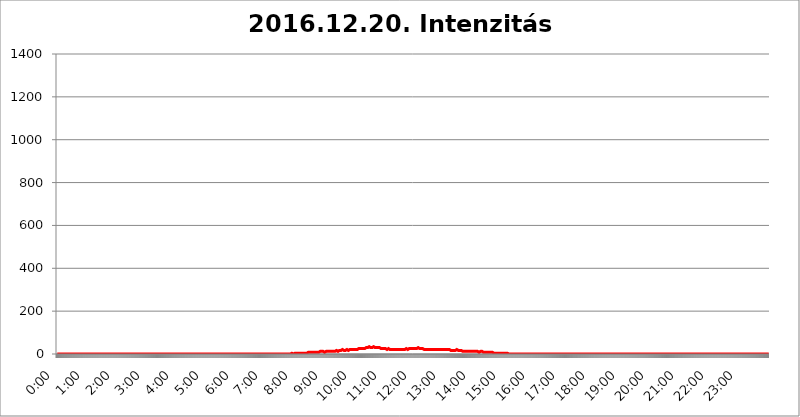
| Category | 2016.12.20. Intenzitás [W/m^2] |
|---|---|
| 0.0 | 0 |
| 0.0006944444444444445 | 0 |
| 0.001388888888888889 | 0 |
| 0.0020833333333333333 | 0 |
| 0.002777777777777778 | 0 |
| 0.003472222222222222 | 0 |
| 0.004166666666666667 | 0 |
| 0.004861111111111111 | 0 |
| 0.005555555555555556 | 0 |
| 0.0062499999999999995 | 0 |
| 0.006944444444444444 | 0 |
| 0.007638888888888889 | 0 |
| 0.008333333333333333 | 0 |
| 0.009027777777777779 | 0 |
| 0.009722222222222222 | 0 |
| 0.010416666666666666 | 0 |
| 0.011111111111111112 | 0 |
| 0.011805555555555555 | 0 |
| 0.012499999999999999 | 0 |
| 0.013194444444444444 | 0 |
| 0.013888888888888888 | 0 |
| 0.014583333333333332 | 0 |
| 0.015277777777777777 | 0 |
| 0.015972222222222224 | 0 |
| 0.016666666666666666 | 0 |
| 0.017361111111111112 | 0 |
| 0.018055555555555557 | 0 |
| 0.01875 | 0 |
| 0.019444444444444445 | 0 |
| 0.02013888888888889 | 0 |
| 0.020833333333333332 | 0 |
| 0.02152777777777778 | 0 |
| 0.022222222222222223 | 0 |
| 0.02291666666666667 | 0 |
| 0.02361111111111111 | 0 |
| 0.024305555555555556 | 0 |
| 0.024999999999999998 | 0 |
| 0.025694444444444447 | 0 |
| 0.02638888888888889 | 0 |
| 0.027083333333333334 | 0 |
| 0.027777777777777776 | 0 |
| 0.02847222222222222 | 0 |
| 0.029166666666666664 | 0 |
| 0.029861111111111113 | 0 |
| 0.030555555555555555 | 0 |
| 0.03125 | 0 |
| 0.03194444444444445 | 0 |
| 0.03263888888888889 | 0 |
| 0.03333333333333333 | 0 |
| 0.034027777777777775 | 0 |
| 0.034722222222222224 | 0 |
| 0.035416666666666666 | 0 |
| 0.036111111111111115 | 0 |
| 0.03680555555555556 | 0 |
| 0.0375 | 0 |
| 0.03819444444444444 | 0 |
| 0.03888888888888889 | 0 |
| 0.03958333333333333 | 0 |
| 0.04027777777777778 | 0 |
| 0.04097222222222222 | 0 |
| 0.041666666666666664 | 0 |
| 0.042361111111111106 | 0 |
| 0.04305555555555556 | 0 |
| 0.043750000000000004 | 0 |
| 0.044444444444444446 | 0 |
| 0.04513888888888889 | 0 |
| 0.04583333333333334 | 0 |
| 0.04652777777777778 | 0 |
| 0.04722222222222222 | 0 |
| 0.04791666666666666 | 0 |
| 0.04861111111111111 | 0 |
| 0.049305555555555554 | 0 |
| 0.049999999999999996 | 0 |
| 0.05069444444444445 | 0 |
| 0.051388888888888894 | 0 |
| 0.052083333333333336 | 0 |
| 0.05277777777777778 | 0 |
| 0.05347222222222222 | 0 |
| 0.05416666666666667 | 0 |
| 0.05486111111111111 | 0 |
| 0.05555555555555555 | 0 |
| 0.05625 | 0 |
| 0.05694444444444444 | 0 |
| 0.057638888888888885 | 0 |
| 0.05833333333333333 | 0 |
| 0.05902777777777778 | 0 |
| 0.059722222222222225 | 0 |
| 0.06041666666666667 | 0 |
| 0.061111111111111116 | 0 |
| 0.06180555555555556 | 0 |
| 0.0625 | 0 |
| 0.06319444444444444 | 0 |
| 0.06388888888888888 | 0 |
| 0.06458333333333334 | 0 |
| 0.06527777777777778 | 0 |
| 0.06597222222222222 | 0 |
| 0.06666666666666667 | 0 |
| 0.06736111111111111 | 0 |
| 0.06805555555555555 | 0 |
| 0.06874999999999999 | 0 |
| 0.06944444444444443 | 0 |
| 0.07013888888888889 | 0 |
| 0.07083333333333333 | 0 |
| 0.07152777777777779 | 0 |
| 0.07222222222222223 | 0 |
| 0.07291666666666667 | 0 |
| 0.07361111111111111 | 0 |
| 0.07430555555555556 | 0 |
| 0.075 | 0 |
| 0.07569444444444444 | 0 |
| 0.0763888888888889 | 0 |
| 0.07708333333333334 | 0 |
| 0.07777777777777778 | 0 |
| 0.07847222222222222 | 0 |
| 0.07916666666666666 | 0 |
| 0.0798611111111111 | 0 |
| 0.08055555555555556 | 0 |
| 0.08125 | 0 |
| 0.08194444444444444 | 0 |
| 0.08263888888888889 | 0 |
| 0.08333333333333333 | 0 |
| 0.08402777777777777 | 0 |
| 0.08472222222222221 | 0 |
| 0.08541666666666665 | 0 |
| 0.08611111111111112 | 0 |
| 0.08680555555555557 | 0 |
| 0.08750000000000001 | 0 |
| 0.08819444444444445 | 0 |
| 0.08888888888888889 | 0 |
| 0.08958333333333333 | 0 |
| 0.09027777777777778 | 0 |
| 0.09097222222222222 | 0 |
| 0.09166666666666667 | 0 |
| 0.09236111111111112 | 0 |
| 0.09305555555555556 | 0 |
| 0.09375 | 0 |
| 0.09444444444444444 | 0 |
| 0.09513888888888888 | 0 |
| 0.09583333333333333 | 0 |
| 0.09652777777777777 | 0 |
| 0.09722222222222222 | 0 |
| 0.09791666666666667 | 0 |
| 0.09861111111111111 | 0 |
| 0.09930555555555555 | 0 |
| 0.09999999999999999 | 0 |
| 0.10069444444444443 | 0 |
| 0.1013888888888889 | 0 |
| 0.10208333333333335 | 0 |
| 0.10277777777777779 | 0 |
| 0.10347222222222223 | 0 |
| 0.10416666666666667 | 0 |
| 0.10486111111111111 | 0 |
| 0.10555555555555556 | 0 |
| 0.10625 | 0 |
| 0.10694444444444444 | 0 |
| 0.1076388888888889 | 0 |
| 0.10833333333333334 | 0 |
| 0.10902777777777778 | 0 |
| 0.10972222222222222 | 0 |
| 0.1111111111111111 | 0 |
| 0.11180555555555556 | 0 |
| 0.11180555555555556 | 0 |
| 0.1125 | 0 |
| 0.11319444444444444 | 0 |
| 0.11388888888888889 | 0 |
| 0.11458333333333333 | 0 |
| 0.11527777777777777 | 0 |
| 0.11597222222222221 | 0 |
| 0.11666666666666665 | 0 |
| 0.1173611111111111 | 0 |
| 0.11805555555555557 | 0 |
| 0.11944444444444445 | 0 |
| 0.12013888888888889 | 0 |
| 0.12083333333333333 | 0 |
| 0.12152777777777778 | 0 |
| 0.12222222222222223 | 0 |
| 0.12291666666666667 | 0 |
| 0.12291666666666667 | 0 |
| 0.12361111111111112 | 0 |
| 0.12430555555555556 | 0 |
| 0.125 | 0 |
| 0.12569444444444444 | 0 |
| 0.12638888888888888 | 0 |
| 0.12708333333333333 | 0 |
| 0.16875 | 0 |
| 0.12847222222222224 | 0 |
| 0.12916666666666668 | 0 |
| 0.12986111111111112 | 0 |
| 0.13055555555555556 | 0 |
| 0.13125 | 0 |
| 0.13194444444444445 | 0 |
| 0.1326388888888889 | 0 |
| 0.13333333333333333 | 0 |
| 0.13402777777777777 | 0 |
| 0.13402777777777777 | 0 |
| 0.13472222222222222 | 0 |
| 0.13541666666666666 | 0 |
| 0.1361111111111111 | 0 |
| 0.13749999999999998 | 0 |
| 0.13819444444444443 | 0 |
| 0.1388888888888889 | 0 |
| 0.13958333333333334 | 0 |
| 0.14027777777777778 | 0 |
| 0.14097222222222222 | 0 |
| 0.14166666666666666 | 0 |
| 0.1423611111111111 | 0 |
| 0.14305555555555557 | 0 |
| 0.14375000000000002 | 0 |
| 0.14444444444444446 | 0 |
| 0.1451388888888889 | 0 |
| 0.1451388888888889 | 0 |
| 0.14652777777777778 | 0 |
| 0.14722222222222223 | 0 |
| 0.14791666666666667 | 0 |
| 0.1486111111111111 | 0 |
| 0.14930555555555555 | 0 |
| 0.15 | 0 |
| 0.15069444444444444 | 0 |
| 0.15138888888888888 | 0 |
| 0.15208333333333332 | 0 |
| 0.15277777777777776 | 0 |
| 0.15347222222222223 | 0 |
| 0.15416666666666667 | 0 |
| 0.15486111111111112 | 0 |
| 0.15555555555555556 | 0 |
| 0.15625 | 0 |
| 0.15694444444444444 | 0 |
| 0.15763888888888888 | 0 |
| 0.15833333333333333 | 0 |
| 0.15902777777777777 | 0 |
| 0.15972222222222224 | 0 |
| 0.16041666666666668 | 0 |
| 0.16111111111111112 | 0 |
| 0.16180555555555556 | 0 |
| 0.1625 | 0 |
| 0.16319444444444445 | 0 |
| 0.1638888888888889 | 0 |
| 0.16458333333333333 | 0 |
| 0.16527777777777777 | 0 |
| 0.16597222222222222 | 0 |
| 0.16666666666666666 | 0 |
| 0.1673611111111111 | 0 |
| 0.16805555555555554 | 0 |
| 0.16874999999999998 | 0 |
| 0.16944444444444443 | 0 |
| 0.17013888888888887 | 0 |
| 0.1708333333333333 | 0 |
| 0.17152777777777775 | 0 |
| 0.17222222222222225 | 0 |
| 0.1729166666666667 | 0 |
| 0.17361111111111113 | 0 |
| 0.17430555555555557 | 0 |
| 0.17500000000000002 | 0 |
| 0.17569444444444446 | 0 |
| 0.1763888888888889 | 0 |
| 0.17708333333333334 | 0 |
| 0.17777777777777778 | 0 |
| 0.17847222222222223 | 0 |
| 0.17916666666666667 | 0 |
| 0.1798611111111111 | 0 |
| 0.18055555555555555 | 0 |
| 0.18125 | 0 |
| 0.18194444444444444 | 0 |
| 0.1826388888888889 | 0 |
| 0.18333333333333335 | 0 |
| 0.1840277777777778 | 0 |
| 0.18472222222222223 | 0 |
| 0.18541666666666667 | 0 |
| 0.18611111111111112 | 0 |
| 0.18680555555555556 | 0 |
| 0.1875 | 0 |
| 0.18819444444444444 | 0 |
| 0.18888888888888888 | 0 |
| 0.18958333333333333 | 0 |
| 0.19027777777777777 | 0 |
| 0.1909722222222222 | 0 |
| 0.19166666666666665 | 0 |
| 0.19236111111111112 | 0 |
| 0.19305555555555554 | 0 |
| 0.19375 | 0 |
| 0.19444444444444445 | 0 |
| 0.1951388888888889 | 0 |
| 0.19583333333333333 | 0 |
| 0.19652777777777777 | 0 |
| 0.19722222222222222 | 0 |
| 0.19791666666666666 | 0 |
| 0.1986111111111111 | 0 |
| 0.19930555555555554 | 0 |
| 0.19999999999999998 | 0 |
| 0.20069444444444443 | 0 |
| 0.20138888888888887 | 0 |
| 0.2020833333333333 | 0 |
| 0.2027777777777778 | 0 |
| 0.2034722222222222 | 0 |
| 0.2041666666666667 | 0 |
| 0.20486111111111113 | 0 |
| 0.20555555555555557 | 0 |
| 0.20625000000000002 | 0 |
| 0.20694444444444446 | 0 |
| 0.2076388888888889 | 0 |
| 0.20833333333333334 | 0 |
| 0.20902777777777778 | 0 |
| 0.20972222222222223 | 0 |
| 0.21041666666666667 | 0 |
| 0.2111111111111111 | 0 |
| 0.21180555555555555 | 0 |
| 0.2125 | 0 |
| 0.21319444444444444 | 0 |
| 0.2138888888888889 | 0 |
| 0.21458333333333335 | 0 |
| 0.2152777777777778 | 0 |
| 0.21597222222222223 | 0 |
| 0.21666666666666667 | 0 |
| 0.21736111111111112 | 0 |
| 0.21805555555555556 | 0 |
| 0.21875 | 0 |
| 0.21944444444444444 | 0 |
| 0.22013888888888888 | 0 |
| 0.22083333333333333 | 0 |
| 0.22152777777777777 | 0 |
| 0.2222222222222222 | 0 |
| 0.22291666666666665 | 0 |
| 0.2236111111111111 | 0 |
| 0.22430555555555556 | 0 |
| 0.225 | 0 |
| 0.22569444444444445 | 0 |
| 0.2263888888888889 | 0 |
| 0.22708333333333333 | 0 |
| 0.22777777777777777 | 0 |
| 0.22847222222222222 | 0 |
| 0.22916666666666666 | 0 |
| 0.2298611111111111 | 0 |
| 0.23055555555555554 | 0 |
| 0.23124999999999998 | 0 |
| 0.23194444444444443 | 0 |
| 0.23263888888888887 | 0 |
| 0.2333333333333333 | 0 |
| 0.2340277777777778 | 0 |
| 0.2347222222222222 | 0 |
| 0.2354166666666667 | 0 |
| 0.23611111111111113 | 0 |
| 0.23680555555555557 | 0 |
| 0.23750000000000002 | 0 |
| 0.23819444444444446 | 0 |
| 0.2388888888888889 | 0 |
| 0.23958333333333334 | 0 |
| 0.24027777777777778 | 0 |
| 0.24097222222222223 | 0 |
| 0.24166666666666667 | 0 |
| 0.2423611111111111 | 0 |
| 0.24305555555555555 | 0 |
| 0.24375 | 0 |
| 0.24444444444444446 | 0 |
| 0.24513888888888888 | 0 |
| 0.24583333333333335 | 0 |
| 0.2465277777777778 | 0 |
| 0.24722222222222223 | 0 |
| 0.24791666666666667 | 0 |
| 0.24861111111111112 | 0 |
| 0.24930555555555556 | 0 |
| 0.25 | 0 |
| 0.25069444444444444 | 0 |
| 0.2513888888888889 | 0 |
| 0.2520833333333333 | 0 |
| 0.25277777777777777 | 0 |
| 0.2534722222222222 | 0 |
| 0.25416666666666665 | 0 |
| 0.2548611111111111 | 0 |
| 0.2555555555555556 | 0 |
| 0.25625000000000003 | 0 |
| 0.2569444444444445 | 0 |
| 0.2576388888888889 | 0 |
| 0.25833333333333336 | 0 |
| 0.2590277777777778 | 0 |
| 0.25972222222222224 | 0 |
| 0.2604166666666667 | 0 |
| 0.2611111111111111 | 0 |
| 0.26180555555555557 | 0 |
| 0.2625 | 0 |
| 0.26319444444444445 | 0 |
| 0.2638888888888889 | 0 |
| 0.26458333333333334 | 0 |
| 0.2652777777777778 | 0 |
| 0.2659722222222222 | 0 |
| 0.26666666666666666 | 0 |
| 0.2673611111111111 | 0 |
| 0.26805555555555555 | 0 |
| 0.26875 | 0 |
| 0.26944444444444443 | 0 |
| 0.2701388888888889 | 0 |
| 0.2708333333333333 | 0 |
| 0.27152777777777776 | 0 |
| 0.2722222222222222 | 0 |
| 0.27291666666666664 | 0 |
| 0.2736111111111111 | 0 |
| 0.2743055555555555 | 0 |
| 0.27499999999999997 | 0 |
| 0.27569444444444446 | 0 |
| 0.27638888888888885 | 0 |
| 0.27708333333333335 | 0 |
| 0.2777777777777778 | 0 |
| 0.27847222222222223 | 0 |
| 0.2791666666666667 | 0 |
| 0.2798611111111111 | 0 |
| 0.28055555555555556 | 0 |
| 0.28125 | 0 |
| 0.28194444444444444 | 0 |
| 0.2826388888888889 | 0 |
| 0.2833333333333333 | 0 |
| 0.28402777777777777 | 0 |
| 0.2847222222222222 | 0 |
| 0.28541666666666665 | 0 |
| 0.28611111111111115 | 0 |
| 0.28680555555555554 | 0 |
| 0.28750000000000003 | 0 |
| 0.2881944444444445 | 0 |
| 0.2888888888888889 | 0 |
| 0.28958333333333336 | 0 |
| 0.2902777777777778 | 0 |
| 0.29097222222222224 | 0 |
| 0.2916666666666667 | 0 |
| 0.2923611111111111 | 0 |
| 0.29305555555555557 | 0 |
| 0.29375 | 0 |
| 0.29444444444444445 | 0 |
| 0.2951388888888889 | 0 |
| 0.29583333333333334 | 0 |
| 0.2965277777777778 | 0 |
| 0.2972222222222222 | 0 |
| 0.29791666666666666 | 0 |
| 0.2986111111111111 | 0 |
| 0.29930555555555555 | 0 |
| 0.3 | 0 |
| 0.30069444444444443 | 0 |
| 0.3013888888888889 | 0 |
| 0.3020833333333333 | 0 |
| 0.30277777777777776 | 0 |
| 0.3034722222222222 | 0 |
| 0.30416666666666664 | 0 |
| 0.3048611111111111 | 0 |
| 0.3055555555555555 | 0 |
| 0.30624999999999997 | 0 |
| 0.3069444444444444 | 0 |
| 0.3076388888888889 | 0 |
| 0.30833333333333335 | 0 |
| 0.3090277777777778 | 0 |
| 0.30972222222222223 | 0 |
| 0.3104166666666667 | 0 |
| 0.3111111111111111 | 0 |
| 0.31180555555555556 | 0 |
| 0.3125 | 0 |
| 0.31319444444444444 | 0 |
| 0.3138888888888889 | 0 |
| 0.3145833333333333 | 0 |
| 0.31527777777777777 | 0 |
| 0.3159722222222222 | 0 |
| 0.31666666666666665 | 0 |
| 0.31736111111111115 | 0 |
| 0.31805555555555554 | 0 |
| 0.31875000000000003 | 0 |
| 0.3194444444444445 | 0 |
| 0.3201388888888889 | 0 |
| 0.32083333333333336 | 0 |
| 0.3215277777777778 | 0 |
| 0.32222222222222224 | 0 |
| 0.3229166666666667 | 0 |
| 0.3236111111111111 | 0 |
| 0.32430555555555557 | 0 |
| 0.325 | 0 |
| 0.32569444444444445 | 0 |
| 0.3263888888888889 | 0 |
| 0.32708333333333334 | 0 |
| 0.3277777777777778 | 0 |
| 0.3284722222222222 | 0 |
| 0.32916666666666666 | 3.525 |
| 0.3298611111111111 | 0 |
| 0.33055555555555555 | 0 |
| 0.33125 | 0 |
| 0.33194444444444443 | 3.525 |
| 0.3326388888888889 | 0 |
| 0.3333333333333333 | 3.525 |
| 0.3340277777777778 | 3.525 |
| 0.3347222222222222 | 3.525 |
| 0.3354166666666667 | 3.525 |
| 0.3361111111111111 | 3.525 |
| 0.3368055555555556 | 3.525 |
| 0.33749999999999997 | 3.525 |
| 0.33819444444444446 | 3.525 |
| 0.33888888888888885 | 3.525 |
| 0.33958333333333335 | 3.525 |
| 0.34027777777777773 | 3.525 |
| 0.34097222222222223 | 3.525 |
| 0.3416666666666666 | 3.525 |
| 0.3423611111111111 | 3.525 |
| 0.3430555555555555 | 3.525 |
| 0.34375 | 3.525 |
| 0.3444444444444445 | 3.525 |
| 0.3451388888888889 | 3.525 |
| 0.3458333333333334 | 3.525 |
| 0.34652777777777777 | 3.525 |
| 0.34722222222222227 | 3.525 |
| 0.34791666666666665 | 3.525 |
| 0.34861111111111115 | 3.525 |
| 0.34930555555555554 | 3.525 |
| 0.35000000000000003 | 3.525 |
| 0.3506944444444444 | 7.887 |
| 0.3513888888888889 | 7.887 |
| 0.3520833333333333 | 7.887 |
| 0.3527777777777778 | 7.887 |
| 0.3534722222222222 | 7.887 |
| 0.3541666666666667 | 7.887 |
| 0.3548611111111111 | 7.887 |
| 0.35555555555555557 | 7.887 |
| 0.35625 | 7.887 |
| 0.35694444444444445 | 7.887 |
| 0.3576388888888889 | 7.887 |
| 0.35833333333333334 | 7.887 |
| 0.3590277777777778 | 7.887 |
| 0.3597222222222222 | 7.887 |
| 0.36041666666666666 | 7.887 |
| 0.3611111111111111 | 7.887 |
| 0.36180555555555555 | 7.887 |
| 0.3625 | 7.887 |
| 0.36319444444444443 | 7.887 |
| 0.3638888888888889 | 7.887 |
| 0.3645833333333333 | 7.887 |
| 0.3652777777777778 | 7.887 |
| 0.3659722222222222 | 7.887 |
| 0.3666666666666667 | 7.887 |
| 0.3673611111111111 | 7.887 |
| 0.3680555555555556 | 12.257 |
| 0.36874999999999997 | 12.257 |
| 0.36944444444444446 | 7.887 |
| 0.37013888888888885 | 12.257 |
| 0.37083333333333335 | 12.257 |
| 0.37152777777777773 | 12.257 |
| 0.37222222222222223 | 12.257 |
| 0.3729166666666666 | 12.257 |
| 0.3736111111111111 | 12.257 |
| 0.3743055555555555 | 12.257 |
| 0.375 | 7.887 |
| 0.3756944444444445 | 12.257 |
| 0.3763888888888889 | 12.257 |
| 0.3770833333333334 | 12.257 |
| 0.37777777777777777 | 12.257 |
| 0.37847222222222227 | 12.257 |
| 0.37916666666666665 | 12.257 |
| 0.37986111111111115 | 12.257 |
| 0.38055555555555554 | 12.257 |
| 0.38125000000000003 | 12.257 |
| 0.3819444444444444 | 12.257 |
| 0.3826388888888889 | 12.257 |
| 0.3833333333333333 | 12.257 |
| 0.3840277777777778 | 12.257 |
| 0.3847222222222222 | 12.257 |
| 0.3854166666666667 | 12.257 |
| 0.3861111111111111 | 12.257 |
| 0.38680555555555557 | 12.257 |
| 0.3875 | 12.257 |
| 0.38819444444444445 | 12.257 |
| 0.3888888888888889 | 12.257 |
| 0.38958333333333334 | 12.257 |
| 0.3902777777777778 | 16.636 |
| 0.3909722222222222 | 16.636 |
| 0.39166666666666666 | 16.636 |
| 0.3923611111111111 | 16.636 |
| 0.39305555555555555 | 16.636 |
| 0.39375 | 12.257 |
| 0.39444444444444443 | 16.636 |
| 0.3951388888888889 | 16.636 |
| 0.3958333333333333 | 16.636 |
| 0.3965277777777778 | 16.636 |
| 0.3972222222222222 | 16.636 |
| 0.3979166666666667 | 16.636 |
| 0.3986111111111111 | 16.636 |
| 0.3993055555555556 | 21.024 |
| 0.39999999999999997 | 21.024 |
| 0.40069444444444446 | 21.024 |
| 0.40138888888888885 | 16.636 |
| 0.40208333333333335 | 16.636 |
| 0.40277777777777773 | 21.024 |
| 0.40347222222222223 | 21.024 |
| 0.4041666666666666 | 16.636 |
| 0.4048611111111111 | 21.024 |
| 0.4055555555555555 | 21.024 |
| 0.40625 | 21.024 |
| 0.4069444444444445 | 21.024 |
| 0.4076388888888889 | 21.024 |
| 0.4083333333333334 | 16.636 |
| 0.40902777777777777 | 16.636 |
| 0.40972222222222227 | 16.636 |
| 0.41041666666666665 | 21.024 |
| 0.41111111111111115 | 21.024 |
| 0.41180555555555554 | 21.024 |
| 0.41250000000000003 | 21.024 |
| 0.4131944444444444 | 21.024 |
| 0.4138888888888889 | 21.024 |
| 0.4145833333333333 | 21.024 |
| 0.4152777777777778 | 21.024 |
| 0.4159722222222222 | 21.024 |
| 0.4166666666666667 | 21.024 |
| 0.4173611111111111 | 21.024 |
| 0.41805555555555557 | 21.024 |
| 0.41875 | 21.024 |
| 0.41944444444444445 | 21.024 |
| 0.4201388888888889 | 21.024 |
| 0.42083333333333334 | 21.024 |
| 0.4215277777777778 | 21.024 |
| 0.4222222222222222 | 25.419 |
| 0.42291666666666666 | 25.419 |
| 0.4236111111111111 | 21.024 |
| 0.42430555555555555 | 25.419 |
| 0.425 | 25.419 |
| 0.42569444444444443 | 25.419 |
| 0.4263888888888889 | 25.419 |
| 0.4270833333333333 | 25.419 |
| 0.4277777777777778 | 25.419 |
| 0.4284722222222222 | 25.419 |
| 0.4291666666666667 | 25.419 |
| 0.4298611111111111 | 25.419 |
| 0.4305555555555556 | 25.419 |
| 0.43124999999999997 | 25.419 |
| 0.43194444444444446 | 25.419 |
| 0.43263888888888885 | 25.419 |
| 0.43333333333333335 | 29.823 |
| 0.43402777777777773 | 29.823 |
| 0.43472222222222223 | 29.823 |
| 0.4354166666666666 | 29.823 |
| 0.4361111111111111 | 29.823 |
| 0.4368055555555555 | 34.234 |
| 0.4375 | 34.234 |
| 0.4381944444444445 | 34.234 |
| 0.4388888888888889 | 34.234 |
| 0.4395833333333334 | 29.823 |
| 0.44027777777777777 | 29.823 |
| 0.44097222222222227 | 29.823 |
| 0.44166666666666665 | 29.823 |
| 0.44236111111111115 | 34.234 |
| 0.44305555555555554 | 34.234 |
| 0.44375000000000003 | 34.234 |
| 0.4444444444444444 | 34.234 |
| 0.4451388888888889 | 29.823 |
| 0.4458333333333333 | 29.823 |
| 0.4465277777777778 | 29.823 |
| 0.4472222222222222 | 29.823 |
| 0.4479166666666667 | 29.823 |
| 0.4486111111111111 | 29.823 |
| 0.44930555555555557 | 25.419 |
| 0.45 | 29.823 |
| 0.45069444444444445 | 29.823 |
| 0.4513888888888889 | 29.823 |
| 0.45208333333333334 | 29.823 |
| 0.4527777777777778 | 25.419 |
| 0.4534722222222222 | 25.419 |
| 0.45416666666666666 | 25.419 |
| 0.4548611111111111 | 25.419 |
| 0.45555555555555555 | 25.419 |
| 0.45625 | 25.419 |
| 0.45694444444444443 | 25.419 |
| 0.4576388888888889 | 25.419 |
| 0.4583333333333333 | 25.419 |
| 0.4590277777777778 | 25.419 |
| 0.4597222222222222 | 25.419 |
| 0.4604166666666667 | 25.419 |
| 0.4611111111111111 | 21.024 |
| 0.4618055555555556 | 21.024 |
| 0.46249999999999997 | 21.024 |
| 0.46319444444444446 | 25.419 |
| 0.46388888888888885 | 25.419 |
| 0.46458333333333335 | 25.419 |
| 0.46527777777777773 | 21.024 |
| 0.46597222222222223 | 21.024 |
| 0.4666666666666666 | 21.024 |
| 0.4673611111111111 | 21.024 |
| 0.4680555555555555 | 21.024 |
| 0.46875 | 21.024 |
| 0.4694444444444445 | 21.024 |
| 0.4701388888888889 | 21.024 |
| 0.4708333333333334 | 21.024 |
| 0.47152777777777777 | 21.024 |
| 0.47222222222222227 | 21.024 |
| 0.47291666666666665 | 21.024 |
| 0.47361111111111115 | 21.024 |
| 0.47430555555555554 | 21.024 |
| 0.47500000000000003 | 21.024 |
| 0.4756944444444444 | 21.024 |
| 0.4763888888888889 | 21.024 |
| 0.4770833333333333 | 21.024 |
| 0.4777777777777778 | 21.024 |
| 0.4784722222222222 | 21.024 |
| 0.4791666666666667 | 21.024 |
| 0.4798611111111111 | 21.024 |
| 0.48055555555555557 | 21.024 |
| 0.48125 | 21.024 |
| 0.48194444444444445 | 21.024 |
| 0.4826388888888889 | 21.024 |
| 0.48333333333333334 | 21.024 |
| 0.4840277777777778 | 21.024 |
| 0.4847222222222222 | 21.024 |
| 0.48541666666666666 | 21.024 |
| 0.4861111111111111 | 21.024 |
| 0.48680555555555555 | 21.024 |
| 0.4875 | 21.024 |
| 0.48819444444444443 | 21.024 |
| 0.4888888888888889 | 25.419 |
| 0.4895833333333333 | 25.419 |
| 0.4902777777777778 | 25.419 |
| 0.4909722222222222 | 21.024 |
| 0.4916666666666667 | 21.024 |
| 0.4923611111111111 | 25.419 |
| 0.4930555555555556 | 25.419 |
| 0.49374999999999997 | 25.419 |
| 0.49444444444444446 | 25.419 |
| 0.49513888888888885 | 25.419 |
| 0.49583333333333335 | 25.419 |
| 0.49652777777777773 | 25.419 |
| 0.49722222222222223 | 25.419 |
| 0.4979166666666666 | 25.419 |
| 0.4986111111111111 | 25.419 |
| 0.4993055555555555 | 25.419 |
| 0.5 | 25.419 |
| 0.5006944444444444 | 25.419 |
| 0.5013888888888889 | 25.419 |
| 0.5020833333333333 | 25.419 |
| 0.5027777777777778 | 25.419 |
| 0.5034722222222222 | 25.419 |
| 0.5041666666666667 | 25.419 |
| 0.5048611111111111 | 25.419 |
| 0.5055555555555555 | 29.823 |
| 0.50625 | 29.823 |
| 0.5069444444444444 | 29.823 |
| 0.5076388888888889 | 29.823 |
| 0.5083333333333333 | 25.419 |
| 0.5090277777777777 | 25.419 |
| 0.5097222222222222 | 25.419 |
| 0.5104166666666666 | 25.419 |
| 0.5111111111111112 | 25.419 |
| 0.5118055555555555 | 25.419 |
| 0.5125000000000001 | 25.419 |
| 0.5131944444444444 | 25.419 |
| 0.513888888888889 | 21.024 |
| 0.5145833333333333 | 21.024 |
| 0.5152777777777778 | 21.024 |
| 0.5159722222222222 | 21.024 |
| 0.5166666666666667 | 21.024 |
| 0.517361111111111 | 21.024 |
| 0.5180555555555556 | 21.024 |
| 0.5187499999999999 | 21.024 |
| 0.5194444444444445 | 21.024 |
| 0.5201388888888888 | 21.024 |
| 0.5208333333333334 | 21.024 |
| 0.5215277777777778 | 21.024 |
| 0.5222222222222223 | 21.024 |
| 0.5229166666666667 | 21.024 |
| 0.5236111111111111 | 21.024 |
| 0.5243055555555556 | 21.024 |
| 0.525 | 21.024 |
| 0.5256944444444445 | 21.024 |
| 0.5263888888888889 | 21.024 |
| 0.5270833333333333 | 21.024 |
| 0.5277777777777778 | 21.024 |
| 0.5284722222222222 | 21.024 |
| 0.5291666666666667 | 21.024 |
| 0.5298611111111111 | 21.024 |
| 0.5305555555555556 | 21.024 |
| 0.53125 | 21.024 |
| 0.5319444444444444 | 21.024 |
| 0.5326388888888889 | 21.024 |
| 0.5333333333333333 | 21.024 |
| 0.5340277777777778 | 21.024 |
| 0.5347222222222222 | 21.024 |
| 0.5354166666666667 | 21.024 |
| 0.5361111111111111 | 21.024 |
| 0.5368055555555555 | 21.024 |
| 0.5375 | 21.024 |
| 0.5381944444444444 | 21.024 |
| 0.5388888888888889 | 21.024 |
| 0.5395833333333333 | 21.024 |
| 0.5402777777777777 | 21.024 |
| 0.5409722222222222 | 21.024 |
| 0.5416666666666666 | 21.024 |
| 0.5423611111111112 | 21.024 |
| 0.5430555555555555 | 21.024 |
| 0.5437500000000001 | 21.024 |
| 0.5444444444444444 | 21.024 |
| 0.545138888888889 | 21.024 |
| 0.5458333333333333 | 21.024 |
| 0.5465277777777778 | 21.024 |
| 0.5472222222222222 | 21.024 |
| 0.5479166666666667 | 21.024 |
| 0.548611111111111 | 21.024 |
| 0.5493055555555556 | 21.024 |
| 0.5499999999999999 | 21.024 |
| 0.5506944444444445 | 21.024 |
| 0.5513888888888888 | 16.636 |
| 0.5520833333333334 | 16.636 |
| 0.5527777777777778 | 16.636 |
| 0.5534722222222223 | 16.636 |
| 0.5541666666666667 | 16.636 |
| 0.5548611111111111 | 16.636 |
| 0.5555555555555556 | 16.636 |
| 0.55625 | 16.636 |
| 0.5569444444444445 | 16.636 |
| 0.5576388888888889 | 16.636 |
| 0.5583333333333333 | 16.636 |
| 0.5590277777777778 | 16.636 |
| 0.5597222222222222 | 16.636 |
| 0.5604166666666667 | 21.024 |
| 0.5611111111111111 | 16.636 |
| 0.5618055555555556 | 16.636 |
| 0.5625 | 16.636 |
| 0.5631944444444444 | 16.636 |
| 0.5638888888888889 | 16.636 |
| 0.5645833333333333 | 16.636 |
| 0.5652777777777778 | 16.636 |
| 0.5659722222222222 | 16.636 |
| 0.5666666666666667 | 16.636 |
| 0.5673611111111111 | 16.636 |
| 0.5680555555555555 | 16.636 |
| 0.56875 | 12.257 |
| 0.5694444444444444 | 16.636 |
| 0.5701388888888889 | 16.636 |
| 0.5708333333333333 | 12.257 |
| 0.5715277777777777 | 16.636 |
| 0.5722222222222222 | 12.257 |
| 0.5729166666666666 | 12.257 |
| 0.5736111111111112 | 12.257 |
| 0.5743055555555555 | 12.257 |
| 0.5750000000000001 | 12.257 |
| 0.5756944444444444 | 12.257 |
| 0.576388888888889 | 12.257 |
| 0.5770833333333333 | 12.257 |
| 0.5777777777777778 | 12.257 |
| 0.5784722222222222 | 12.257 |
| 0.5791666666666667 | 12.257 |
| 0.579861111111111 | 12.257 |
| 0.5805555555555556 | 12.257 |
| 0.5812499999999999 | 12.257 |
| 0.5819444444444445 | 12.257 |
| 0.5826388888888888 | 12.257 |
| 0.5833333333333334 | 12.257 |
| 0.5840277777777778 | 12.257 |
| 0.5847222222222223 | 12.257 |
| 0.5854166666666667 | 12.257 |
| 0.5861111111111111 | 12.257 |
| 0.5868055555555556 | 12.257 |
| 0.5875 | 12.257 |
| 0.5881944444444445 | 12.257 |
| 0.5888888888888889 | 12.257 |
| 0.5895833333333333 | 12.257 |
| 0.5902777777777778 | 12.257 |
| 0.5909722222222222 | 7.887 |
| 0.5916666666666667 | 7.887 |
| 0.5923611111111111 | 7.887 |
| 0.5930555555555556 | 7.887 |
| 0.59375 | 12.257 |
| 0.5944444444444444 | 7.887 |
| 0.5951388888888889 | 12.257 |
| 0.5958333333333333 | 12.257 |
| 0.5965277777777778 | 7.887 |
| 0.5972222222222222 | 7.887 |
| 0.5979166666666667 | 7.887 |
| 0.5986111111111111 | 7.887 |
| 0.5993055555555555 | 7.887 |
| 0.6 | 7.887 |
| 0.6006944444444444 | 7.887 |
| 0.6013888888888889 | 7.887 |
| 0.6020833333333333 | 7.887 |
| 0.6027777777777777 | 7.887 |
| 0.6034722222222222 | 7.887 |
| 0.6041666666666666 | 7.887 |
| 0.6048611111111112 | 7.887 |
| 0.6055555555555555 | 7.887 |
| 0.6062500000000001 | 7.887 |
| 0.6069444444444444 | 7.887 |
| 0.607638888888889 | 7.887 |
| 0.6083333333333333 | 7.887 |
| 0.6090277777777778 | 7.887 |
| 0.6097222222222222 | 7.887 |
| 0.6104166666666667 | 7.887 |
| 0.611111111111111 | 7.887 |
| 0.6118055555555556 | 7.887 |
| 0.6124999999999999 | 3.525 |
| 0.6131944444444445 | 3.525 |
| 0.6138888888888888 | 3.525 |
| 0.6145833333333334 | 3.525 |
| 0.6152777777777778 | 3.525 |
| 0.6159722222222223 | 3.525 |
| 0.6166666666666667 | 3.525 |
| 0.6173611111111111 | 3.525 |
| 0.6180555555555556 | 3.525 |
| 0.61875 | 3.525 |
| 0.6194444444444445 | 3.525 |
| 0.6201388888888889 | 3.525 |
| 0.6208333333333333 | 3.525 |
| 0.6215277777777778 | 3.525 |
| 0.6222222222222222 | 3.525 |
| 0.6229166666666667 | 3.525 |
| 0.6236111111111111 | 3.525 |
| 0.6243055555555556 | 3.525 |
| 0.625 | 3.525 |
| 0.6256944444444444 | 3.525 |
| 0.6263888888888889 | 3.525 |
| 0.6270833333333333 | 3.525 |
| 0.6277777777777778 | 3.525 |
| 0.6284722222222222 | 3.525 |
| 0.6291666666666667 | 3.525 |
| 0.6298611111111111 | 3.525 |
| 0.6305555555555555 | 3.525 |
| 0.63125 | 3.525 |
| 0.6319444444444444 | 0 |
| 0.6326388888888889 | 0 |
| 0.6333333333333333 | 0 |
| 0.6340277777777777 | 0 |
| 0.6347222222222222 | 0 |
| 0.6354166666666666 | 0 |
| 0.6361111111111112 | 0 |
| 0.6368055555555555 | 0 |
| 0.6375000000000001 | 0 |
| 0.6381944444444444 | 0 |
| 0.638888888888889 | 0 |
| 0.6395833333333333 | 0 |
| 0.6402777777777778 | 0 |
| 0.6409722222222222 | 0 |
| 0.6416666666666667 | 0 |
| 0.642361111111111 | 0 |
| 0.6430555555555556 | 0 |
| 0.6437499999999999 | 0 |
| 0.6444444444444445 | 0 |
| 0.6451388888888888 | 0 |
| 0.6458333333333334 | 0 |
| 0.6465277777777778 | 0 |
| 0.6472222222222223 | 0 |
| 0.6479166666666667 | 0 |
| 0.6486111111111111 | 0 |
| 0.6493055555555556 | 0 |
| 0.65 | 0 |
| 0.6506944444444445 | 0 |
| 0.6513888888888889 | 0 |
| 0.6520833333333333 | 0 |
| 0.6527777777777778 | 0 |
| 0.6534722222222222 | 0 |
| 0.6541666666666667 | 0 |
| 0.6548611111111111 | 0 |
| 0.6555555555555556 | 0 |
| 0.65625 | 0 |
| 0.6569444444444444 | 0 |
| 0.6576388888888889 | 0 |
| 0.6583333333333333 | 0 |
| 0.6590277777777778 | 0 |
| 0.6597222222222222 | 0 |
| 0.6604166666666667 | 0 |
| 0.6611111111111111 | 0 |
| 0.6618055555555555 | 0 |
| 0.6625 | 0 |
| 0.6631944444444444 | 0 |
| 0.6638888888888889 | 0 |
| 0.6645833333333333 | 0 |
| 0.6652777777777777 | 0 |
| 0.6659722222222222 | 0 |
| 0.6666666666666666 | 0 |
| 0.6673611111111111 | 0 |
| 0.6680555555555556 | 0 |
| 0.6687500000000001 | 0 |
| 0.6694444444444444 | 0 |
| 0.6701388888888888 | 0 |
| 0.6708333333333334 | 0 |
| 0.6715277777777778 | 0 |
| 0.6722222222222222 | 0 |
| 0.6729166666666666 | 0 |
| 0.6736111111111112 | 0 |
| 0.6743055555555556 | 0 |
| 0.6749999999999999 | 0 |
| 0.6756944444444444 | 0 |
| 0.6763888888888889 | 0 |
| 0.6770833333333334 | 0 |
| 0.6777777777777777 | 0 |
| 0.6784722222222223 | 0 |
| 0.6791666666666667 | 0 |
| 0.6798611111111111 | 0 |
| 0.6805555555555555 | 0 |
| 0.68125 | 0 |
| 0.6819444444444445 | 0 |
| 0.6826388888888889 | 0 |
| 0.6833333333333332 | 0 |
| 0.6840277777777778 | 0 |
| 0.6847222222222222 | 0 |
| 0.6854166666666667 | 0 |
| 0.686111111111111 | 0 |
| 0.6868055555555556 | 0 |
| 0.6875 | 0 |
| 0.6881944444444444 | 0 |
| 0.688888888888889 | 0 |
| 0.6895833333333333 | 0 |
| 0.6902777777777778 | 0 |
| 0.6909722222222222 | 0 |
| 0.6916666666666668 | 0 |
| 0.6923611111111111 | 0 |
| 0.6930555555555555 | 0 |
| 0.69375 | 0 |
| 0.6944444444444445 | 0 |
| 0.6951388888888889 | 0 |
| 0.6958333333333333 | 0 |
| 0.6965277777777777 | 0 |
| 0.6972222222222223 | 0 |
| 0.6979166666666666 | 0 |
| 0.6986111111111111 | 0 |
| 0.6993055555555556 | 0 |
| 0.7000000000000001 | 0 |
| 0.7006944444444444 | 0 |
| 0.7013888888888888 | 0 |
| 0.7020833333333334 | 0 |
| 0.7027777777777778 | 0 |
| 0.7034722222222222 | 0 |
| 0.7041666666666666 | 0 |
| 0.7048611111111112 | 0 |
| 0.7055555555555556 | 0 |
| 0.7062499999999999 | 0 |
| 0.7069444444444444 | 0 |
| 0.7076388888888889 | 0 |
| 0.7083333333333334 | 0 |
| 0.7090277777777777 | 0 |
| 0.7097222222222223 | 0 |
| 0.7104166666666667 | 0 |
| 0.7111111111111111 | 0 |
| 0.7118055555555555 | 0 |
| 0.7125 | 0 |
| 0.7131944444444445 | 0 |
| 0.7138888888888889 | 0 |
| 0.7145833333333332 | 0 |
| 0.7152777777777778 | 0 |
| 0.7159722222222222 | 0 |
| 0.7166666666666667 | 0 |
| 0.717361111111111 | 0 |
| 0.7180555555555556 | 0 |
| 0.71875 | 0 |
| 0.7194444444444444 | 0 |
| 0.720138888888889 | 0 |
| 0.7208333333333333 | 0 |
| 0.7215277777777778 | 0 |
| 0.7222222222222222 | 0 |
| 0.7229166666666668 | 0 |
| 0.7236111111111111 | 0 |
| 0.7243055555555555 | 0 |
| 0.725 | 0 |
| 0.7256944444444445 | 0 |
| 0.7263888888888889 | 0 |
| 0.7270833333333333 | 0 |
| 0.7277777777777777 | 0 |
| 0.7284722222222223 | 0 |
| 0.7291666666666666 | 0 |
| 0.7298611111111111 | 0 |
| 0.7305555555555556 | 0 |
| 0.7312500000000001 | 0 |
| 0.7319444444444444 | 0 |
| 0.7326388888888888 | 0 |
| 0.7333333333333334 | 0 |
| 0.7340277777777778 | 0 |
| 0.7347222222222222 | 0 |
| 0.7354166666666666 | 0 |
| 0.7361111111111112 | 0 |
| 0.7368055555555556 | 0 |
| 0.7374999999999999 | 0 |
| 0.7381944444444444 | 0 |
| 0.7388888888888889 | 0 |
| 0.7395833333333334 | 0 |
| 0.7402777777777777 | 0 |
| 0.7409722222222223 | 0 |
| 0.7416666666666667 | 0 |
| 0.7423611111111111 | 0 |
| 0.7430555555555555 | 0 |
| 0.74375 | 0 |
| 0.7444444444444445 | 0 |
| 0.7451388888888889 | 0 |
| 0.7458333333333332 | 0 |
| 0.7465277777777778 | 0 |
| 0.7472222222222222 | 0 |
| 0.7479166666666667 | 0 |
| 0.748611111111111 | 0 |
| 0.7493055555555556 | 0 |
| 0.75 | 0 |
| 0.7506944444444444 | 0 |
| 0.751388888888889 | 0 |
| 0.7520833333333333 | 0 |
| 0.7527777777777778 | 0 |
| 0.7534722222222222 | 0 |
| 0.7541666666666668 | 0 |
| 0.7548611111111111 | 0 |
| 0.7555555555555555 | 0 |
| 0.75625 | 0 |
| 0.7569444444444445 | 0 |
| 0.7576388888888889 | 0 |
| 0.7583333333333333 | 0 |
| 0.7590277777777777 | 0 |
| 0.7597222222222223 | 0 |
| 0.7604166666666666 | 0 |
| 0.7611111111111111 | 0 |
| 0.7618055555555556 | 0 |
| 0.7625000000000001 | 0 |
| 0.7631944444444444 | 0 |
| 0.7638888888888888 | 0 |
| 0.7645833333333334 | 0 |
| 0.7652777777777778 | 0 |
| 0.7659722222222222 | 0 |
| 0.7666666666666666 | 0 |
| 0.7673611111111112 | 0 |
| 0.7680555555555556 | 0 |
| 0.7687499999999999 | 0 |
| 0.7694444444444444 | 0 |
| 0.7701388888888889 | 0 |
| 0.7708333333333334 | 0 |
| 0.7715277777777777 | 0 |
| 0.7722222222222223 | 0 |
| 0.7729166666666667 | 0 |
| 0.7736111111111111 | 0 |
| 0.7743055555555555 | 0 |
| 0.775 | 0 |
| 0.7756944444444445 | 0 |
| 0.7763888888888889 | 0 |
| 0.7770833333333332 | 0 |
| 0.7777777777777778 | 0 |
| 0.7784722222222222 | 0 |
| 0.7791666666666667 | 0 |
| 0.779861111111111 | 0 |
| 0.7805555555555556 | 0 |
| 0.78125 | 0 |
| 0.7819444444444444 | 0 |
| 0.782638888888889 | 0 |
| 0.7833333333333333 | 0 |
| 0.7840277777777778 | 0 |
| 0.7847222222222222 | 0 |
| 0.7854166666666668 | 0 |
| 0.7861111111111111 | 0 |
| 0.7868055555555555 | 0 |
| 0.7875 | 0 |
| 0.7881944444444445 | 0 |
| 0.7888888888888889 | 0 |
| 0.7895833333333333 | 0 |
| 0.7902777777777777 | 0 |
| 0.7909722222222223 | 0 |
| 0.7916666666666666 | 0 |
| 0.7923611111111111 | 0 |
| 0.7930555555555556 | 0 |
| 0.7937500000000001 | 0 |
| 0.7944444444444444 | 0 |
| 0.7951388888888888 | 0 |
| 0.7958333333333334 | 0 |
| 0.7965277777777778 | 0 |
| 0.7972222222222222 | 0 |
| 0.7979166666666666 | 0 |
| 0.7986111111111112 | 0 |
| 0.7993055555555556 | 0 |
| 0.7999999999999999 | 0 |
| 0.8006944444444444 | 0 |
| 0.8013888888888889 | 0 |
| 0.8020833333333334 | 0 |
| 0.8027777777777777 | 0 |
| 0.8034722222222223 | 0 |
| 0.8041666666666667 | 0 |
| 0.8048611111111111 | 0 |
| 0.8055555555555555 | 0 |
| 0.80625 | 0 |
| 0.8069444444444445 | 0 |
| 0.8076388888888889 | 0 |
| 0.8083333333333332 | 0 |
| 0.8090277777777778 | 0 |
| 0.8097222222222222 | 0 |
| 0.8104166666666667 | 0 |
| 0.811111111111111 | 0 |
| 0.8118055555555556 | 0 |
| 0.8125 | 0 |
| 0.8131944444444444 | 0 |
| 0.813888888888889 | 0 |
| 0.8145833333333333 | 0 |
| 0.8152777777777778 | 0 |
| 0.8159722222222222 | 0 |
| 0.8166666666666668 | 0 |
| 0.8173611111111111 | 0 |
| 0.8180555555555555 | 0 |
| 0.81875 | 0 |
| 0.8194444444444445 | 0 |
| 0.8201388888888889 | 0 |
| 0.8208333333333333 | 0 |
| 0.8215277777777777 | 0 |
| 0.8222222222222223 | 0 |
| 0.8229166666666666 | 0 |
| 0.8236111111111111 | 0 |
| 0.8243055555555556 | 0 |
| 0.8250000000000001 | 0 |
| 0.8256944444444444 | 0 |
| 0.8263888888888888 | 0 |
| 0.8270833333333334 | 0 |
| 0.8277777777777778 | 0 |
| 0.8284722222222222 | 0 |
| 0.8291666666666666 | 0 |
| 0.8298611111111112 | 0 |
| 0.8305555555555556 | 0 |
| 0.8312499999999999 | 0 |
| 0.8319444444444444 | 0 |
| 0.8326388888888889 | 0 |
| 0.8333333333333334 | 0 |
| 0.8340277777777777 | 0 |
| 0.8347222222222223 | 0 |
| 0.8354166666666667 | 0 |
| 0.8361111111111111 | 0 |
| 0.8368055555555555 | 0 |
| 0.8375 | 0 |
| 0.8381944444444445 | 0 |
| 0.8388888888888889 | 0 |
| 0.8395833333333332 | 0 |
| 0.8402777777777778 | 0 |
| 0.8409722222222222 | 0 |
| 0.8416666666666667 | 0 |
| 0.842361111111111 | 0 |
| 0.8430555555555556 | 0 |
| 0.84375 | 0 |
| 0.8444444444444444 | 0 |
| 0.845138888888889 | 0 |
| 0.8458333333333333 | 0 |
| 0.8465277777777778 | 0 |
| 0.8472222222222222 | 0 |
| 0.8479166666666668 | 0 |
| 0.8486111111111111 | 0 |
| 0.8493055555555555 | 0 |
| 0.85 | 0 |
| 0.8506944444444445 | 0 |
| 0.8513888888888889 | 0 |
| 0.8520833333333333 | 0 |
| 0.8527777777777777 | 0 |
| 0.8534722222222223 | 0 |
| 0.8541666666666666 | 0 |
| 0.8548611111111111 | 0 |
| 0.8555555555555556 | 0 |
| 0.8562500000000001 | 0 |
| 0.8569444444444444 | 0 |
| 0.8576388888888888 | 0 |
| 0.8583333333333334 | 0 |
| 0.8590277777777778 | 0 |
| 0.8597222222222222 | 0 |
| 0.8604166666666666 | 0 |
| 0.8611111111111112 | 0 |
| 0.8618055555555556 | 0 |
| 0.8624999999999999 | 0 |
| 0.8631944444444444 | 0 |
| 0.8638888888888889 | 0 |
| 0.8645833333333334 | 0 |
| 0.8652777777777777 | 0 |
| 0.8659722222222223 | 0 |
| 0.8666666666666667 | 0 |
| 0.8673611111111111 | 0 |
| 0.8680555555555555 | 0 |
| 0.86875 | 0 |
| 0.8694444444444445 | 0 |
| 0.8701388888888889 | 0 |
| 0.8708333333333332 | 0 |
| 0.8715277777777778 | 0 |
| 0.8722222222222222 | 0 |
| 0.8729166666666667 | 0 |
| 0.873611111111111 | 0 |
| 0.8743055555555556 | 0 |
| 0.875 | 0 |
| 0.8756944444444444 | 0 |
| 0.876388888888889 | 0 |
| 0.8770833333333333 | 0 |
| 0.8777777777777778 | 0 |
| 0.8784722222222222 | 0 |
| 0.8791666666666668 | 0 |
| 0.8798611111111111 | 0 |
| 0.8805555555555555 | 0 |
| 0.88125 | 0 |
| 0.8819444444444445 | 0 |
| 0.8826388888888889 | 0 |
| 0.8833333333333333 | 0 |
| 0.8840277777777777 | 0 |
| 0.8847222222222223 | 0 |
| 0.8854166666666666 | 0 |
| 0.8861111111111111 | 0 |
| 0.8868055555555556 | 0 |
| 0.8875000000000001 | 0 |
| 0.8881944444444444 | 0 |
| 0.8888888888888888 | 0 |
| 0.8895833333333334 | 0 |
| 0.8902777777777778 | 0 |
| 0.8909722222222222 | 0 |
| 0.8916666666666666 | 0 |
| 0.8923611111111112 | 0 |
| 0.8930555555555556 | 0 |
| 0.8937499999999999 | 0 |
| 0.8944444444444444 | 0 |
| 0.8951388888888889 | 0 |
| 0.8958333333333334 | 0 |
| 0.8965277777777777 | 0 |
| 0.8972222222222223 | 0 |
| 0.8979166666666667 | 0 |
| 0.8986111111111111 | 0 |
| 0.8993055555555555 | 0 |
| 0.9 | 0 |
| 0.9006944444444445 | 0 |
| 0.9013888888888889 | 0 |
| 0.9020833333333332 | 0 |
| 0.9027777777777778 | 0 |
| 0.9034722222222222 | 0 |
| 0.9041666666666667 | 0 |
| 0.904861111111111 | 0 |
| 0.9055555555555556 | 0 |
| 0.90625 | 0 |
| 0.9069444444444444 | 0 |
| 0.907638888888889 | 0 |
| 0.9083333333333333 | 0 |
| 0.9090277777777778 | 0 |
| 0.9097222222222222 | 0 |
| 0.9104166666666668 | 0 |
| 0.9111111111111111 | 0 |
| 0.9118055555555555 | 0 |
| 0.9125 | 0 |
| 0.9131944444444445 | 0 |
| 0.9138888888888889 | 0 |
| 0.9145833333333333 | 0 |
| 0.9152777777777777 | 0 |
| 0.9159722222222223 | 0 |
| 0.9166666666666666 | 0 |
| 0.9173611111111111 | 0 |
| 0.9180555555555556 | 0 |
| 0.9187500000000001 | 0 |
| 0.9194444444444444 | 0 |
| 0.9201388888888888 | 0 |
| 0.9208333333333334 | 0 |
| 0.9215277777777778 | 0 |
| 0.9222222222222222 | 0 |
| 0.9229166666666666 | 0 |
| 0.9236111111111112 | 0 |
| 0.9243055555555556 | 0 |
| 0.9249999999999999 | 0 |
| 0.9256944444444444 | 0 |
| 0.9263888888888889 | 0 |
| 0.9270833333333334 | 0 |
| 0.9277777777777777 | 0 |
| 0.9284722222222223 | 0 |
| 0.9291666666666667 | 0 |
| 0.9298611111111111 | 0 |
| 0.9305555555555555 | 0 |
| 0.93125 | 0 |
| 0.9319444444444445 | 0 |
| 0.9326388888888889 | 0 |
| 0.9333333333333332 | 0 |
| 0.9340277777777778 | 0 |
| 0.9347222222222222 | 0 |
| 0.9354166666666667 | 0 |
| 0.936111111111111 | 0 |
| 0.9368055555555556 | 0 |
| 0.9375 | 0 |
| 0.9381944444444444 | 0 |
| 0.938888888888889 | 0 |
| 0.9395833333333333 | 0 |
| 0.9402777777777778 | 0 |
| 0.9409722222222222 | 0 |
| 0.9416666666666668 | 0 |
| 0.9423611111111111 | 0 |
| 0.9430555555555555 | 0 |
| 0.94375 | 0 |
| 0.9444444444444445 | 0 |
| 0.9451388888888889 | 0 |
| 0.9458333333333333 | 0 |
| 0.9465277777777777 | 0 |
| 0.9472222222222223 | 0 |
| 0.9479166666666666 | 0 |
| 0.9486111111111111 | 0 |
| 0.9493055555555556 | 0 |
| 0.9500000000000001 | 0 |
| 0.9506944444444444 | 0 |
| 0.9513888888888888 | 0 |
| 0.9520833333333334 | 0 |
| 0.9527777777777778 | 0 |
| 0.9534722222222222 | 0 |
| 0.9541666666666666 | 0 |
| 0.9548611111111112 | 0 |
| 0.9555555555555556 | 0 |
| 0.9562499999999999 | 0 |
| 0.9569444444444444 | 0 |
| 0.9576388888888889 | 0 |
| 0.9583333333333334 | 0 |
| 0.9590277777777777 | 0 |
| 0.9597222222222223 | 0 |
| 0.9604166666666667 | 0 |
| 0.9611111111111111 | 0 |
| 0.9618055555555555 | 0 |
| 0.9625 | 0 |
| 0.9631944444444445 | 0 |
| 0.9638888888888889 | 0 |
| 0.9645833333333332 | 0 |
| 0.9652777777777778 | 0 |
| 0.9659722222222222 | 0 |
| 0.9666666666666667 | 0 |
| 0.967361111111111 | 0 |
| 0.9680555555555556 | 0 |
| 0.96875 | 0 |
| 0.9694444444444444 | 0 |
| 0.970138888888889 | 0 |
| 0.9708333333333333 | 0 |
| 0.9715277777777778 | 0 |
| 0.9722222222222222 | 0 |
| 0.9729166666666668 | 0 |
| 0.9736111111111111 | 0 |
| 0.9743055555555555 | 0 |
| 0.975 | 0 |
| 0.9756944444444445 | 0 |
| 0.9763888888888889 | 0 |
| 0.9770833333333333 | 0 |
| 0.9777777777777777 | 0 |
| 0.9784722222222223 | 0 |
| 0.9791666666666666 | 0 |
| 0.9798611111111111 | 0 |
| 0.9805555555555556 | 0 |
| 0.9812500000000001 | 0 |
| 0.9819444444444444 | 0 |
| 0.9826388888888888 | 0 |
| 0.9833333333333334 | 0 |
| 0.9840277777777778 | 0 |
| 0.9847222222222222 | 0 |
| 0.9854166666666666 | 0 |
| 0.9861111111111112 | 0 |
| 0.9868055555555556 | 0 |
| 0.9874999999999999 | 0 |
| 0.9881944444444444 | 0 |
| 0.9888888888888889 | 0 |
| 0.9895833333333334 | 0 |
| 0.9902777777777777 | 0 |
| 0.9909722222222223 | 0 |
| 0.9916666666666667 | 0 |
| 0.9923611111111111 | 0 |
| 0.9930555555555555 | 0 |
| 0.99375 | 0 |
| 0.9944444444444445 | 0 |
| 0.9951388888888889 | 0 |
| 0.9958333333333332 | 0 |
| 0.9965277777777778 | 0 |
| 0.9972222222222222 | 0 |
| 0.9979166666666667 | 0 |
| 0.998611111111111 | 0 |
| 0.9993055555555556 | 0 |